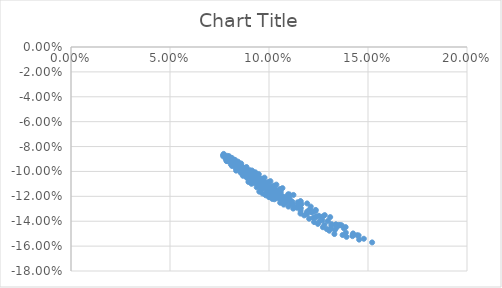
| Category | Series 0 |
|---|---|
| 0.07849210297705407 | -0.092 |
| 0.0811743257709537 | -0.094 |
| 0.08559861464190656 | -0.1 |
| 0.08865699809654287 | -0.103 |
| 0.0918520796829344 | -0.106 |
| 0.09573665319920564 | -0.11 |
| 0.09916619754605611 | -0.113 |
| 0.10387649270633424 | -0.117 |
| 0.10808851076847913 | -0.121 |
| 0.1118035528330265 | -0.124 |
| 0.11558868214379826 | -0.127 |
| 0.12127132130758715 | -0.133 |
| 0.1251883458378177 | -0.136 |
| 0.12973217934383538 | -0.14 |
| 0.13374420981332527 | -0.143 |
| 0.13779836612817092 | -0.146 |
| 0.14246406537783846 | -0.15 |
| 0.14791270222244338 | -0.154 |
| 0.15207736131235677 | -0.157 |
| 0.0833814307801798 | -0.099 |
| 0.08683115969566685 | -0.103 |
| 0.08880676271872487 | -0.105 |
| 0.09252270961221412 | -0.109 |
| 0.09467047227318069 | -0.111 |
| 0.09802187939158186 | -0.114 |
| 0.10206178969027282 | -0.118 |
| 0.10442470539097172 | -0.12 |
| 0.10804075292779088 | -0.122 |
| 0.11231933829241132 | -0.127 |
| 0.11608447652906288 | -0.13 |
| 0.11924286329137909 | -0.132 |
| 0.1237006269620872 | -0.136 |
| 0.12693277459077076 | -0.139 |
| 0.13148073296946738 | -0.143 |
| 0.13418809053347397 | -0.145 |
| 0.13881037753769906 | -0.149 |
| 0.1421556177082096 | -0.152 |
| 0.14552048095315892 | -0.155 |
| 0.08961711038147725 | -0.108 |
| 0.09114011177796506 | -0.11 |
| 0.09378573611604699 | -0.113 |
| 0.09590673387094169 | -0.114 |
| 0.09868984598151245 | -0.117 |
| 0.10093678670850117 | -0.119 |
| 0.10383717438005824 | -0.122 |
| 0.10619284299159418 | -0.123 |
| 0.10859855041904543 | -0.125 |
| 0.11286548480720748 | -0.129 |
| 0.11596493645428099 | -0.132 |
| 0.1191016679560657 | -0.134 |
| 0.12227281026450827 | -0.137 |
| 0.12547575441907483 | -0.14 |
| 0.1280261589043001 | -0.143 |
| 0.13127682578834932 | -0.146 |
| 0.13325904506316058 | -0.147 |
| 0.13715070052754968 | -0.151 |
| 0.1391586222896598 | -0.153 |
| 0.09510931711654969 | -0.116 |
| 0.09670132659841102 | -0.118 |
| 0.09832324809696294 | -0.119 |
| 0.09997362579055317 | -0.121 |
| 0.10165107366875394 | -0.122 |
| 0.10274384304672825 | -0.122 |
| 0.10564920168064439 | -0.125 |
| 0.10741169900584152 | -0.127 |
| 0.10979202662454098 | -0.128 |
| 0.11221973653686829 | -0.13 |
| 0.1159002454778847 | -0.134 |
| 0.11776940820301726 | -0.135 |
| 0.12026264207487335 | -0.138 |
| 0.12277283353342405 | -0.141 |
| 0.12468709261671139 | -0.142 |
| 0.12722627658530808 | -0.145 |
| 0.12916722053590737 | -0.146 |
| 0.13044814280565367 | -0.148 |
| 0.13301976983096028 | -0.15 |
| 0.07822905865678728 | -0.089 |
| 0.08097957270178449 | -0.092 |
| 0.08236788085575084 | -0.093 |
| 0.084889873784626 | -0.096 |
| 0.08591629263298864 | -0.096 |
| 0.08750258803188682 | -0.097 |
| 0.08912208857341217 | -0.099 |
| 0.09024580869491589 | -0.099 |
| 0.09192501018924845 | -0.1 |
| 0.09363257550935863 | -0.102 |
| 0.09704292489098112 | -0.106 |
| 0.0999808555089506 | -0.109 |
| 0.10297138273422739 | -0.112 |
| 0.1060100554338495 | -0.114 |
| 0.1103126754157474 | -0.119 |
| 0.11592994606834588 | -0.124 |
| 0.12108860662438246 | -0.128 |
| 0.12816872656147238 | -0.135 |
| 0.13870159746175426 | -0.145 |
| 0.08160285703052578 | -0.095 |
| 0.08348862843864494 | -0.096 |
| 0.08546133636133703 | -0.098 |
| 0.08805931034306258 | -0.101 |
| 0.08965325537013248 | -0.102 |
| 0.09127935388551334 | -0.104 |
| 0.09293591813706709 | -0.105 |
| 0.0946213480200461 | -0.107 |
| 0.09747758711142347 | -0.109 |
| 0.09922898461902414 | -0.111 |
| 0.10336109981956515 | -0.115 |
| 0.10581765924118058 | -0.117 |
| 0.11009598525346843 | -0.121 |
| 0.11444827102217514 | -0.125 |
| 0.12081331408204345 | -0.13 |
| 0.12730151203727216 | -0.136 |
| 0.13519327501638426 | -0.143 |
| 0.1452691534604774 | -0.151 |
| 0.0788787536411368 | -0.092 |
| 0.08312837440972774 | -0.097 |
| 0.085045745859657 | -0.099 |
| 0.08760035880392981 | -0.102 |
| 0.09023834458433486 | -0.104 |
| 0.0918520796829344 | -0.106 |
| 0.09349652634064731 | -0.107 |
| 0.09573665319920564 | -0.11 |
| 0.09743841982144451 | -0.111 |
| 0.09916619754605611 | -0.113 |
| 0.10091865041267142 | -0.114 |
| 0.10387649270633424 | -0.117 |
| 0.10688390650521354 | -0.12 |
| 0.11058067157896682 | -0.123 |
| 0.11492392590011687 | -0.127 |
| 0.12001186464518468 | -0.131 |
| 0.12646402436956816 | -0.137 |
| 0.13374420981332527 | -0.143 |
| 0.14452271871474948 | -0.151 |
| 0.08130091331750335 | -0.096 |
| 0.08569504999576223 | -0.101 |
| 0.08823589304508511 | -0.104 |
| 0.09143581655516232 | -0.108 |
| 0.09414068191080142 | -0.111 |
| 0.09637320318831566 | -0.113 |
| 0.0969150113715317 | -0.114 |
| 0.09919242179984171 | -0.116 |
| 0.10090858400734913 | -0.118 |
| 0.10207140044719216 | -0.119 |
| 0.10382400090768831 | -0.12 |
| 0.10559936423405429 | -0.122 |
| 0.10859855041904543 | -0.125 |
| 0.11105104472573117 | -0.126 |
| 0.11413629455739308 | -0.129 |
| 0.11916560504409618 | -0.133 |
| 0.1237006269620872 | -0.136 |
| 0.13160072027135306 | -0.142 |
| 0.07680502588611007 | -0.087 |
| 0.07712202008027774 | -0.086 |
| 0.07893050702036414 | -0.087 |
| 0.07985721487562175 | -0.088 |
| 0.08132213667552692 | -0.089 |
| 0.08282726149151125 | -0.091 |
| 0.08437043774819197 | -0.092 |
| 0.08594961589436044 | -0.094 |
| 0.08863840954822756 | -0.096 |
| 0.09140180971448308 | -0.099 |
| 0.09310800124228577 | -0.101 |
| 0.09484123132115391 | -0.102 |
| 0.09775156014153447 | -0.105 |
| 0.10071726693416282 | -0.108 |
| 0.1037336020981766 | -0.111 |
| 0.1067962759033771 | -0.113 |
| 0.11235447893947857 | -0.119 |
| 0.11927553767714538 | -0.126 |
| 0.07692371617648976 | -0.088 |
| 0.07906357258786349 | -0.09 |
| 0.07994208478115028 | -0.09 |
| 0.08236788085575084 | -0.093 |
| 0.08334377057565001 | -0.093 |
| 0.08487538556536457 | -0.094 |
| 0.08644320819416787 | -0.096 |
| 0.0880453042351461 | -0.097 |
| 0.09020901699208869 | -0.1 |
| 0.09298775498995428 | -0.103 |
| 0.09469772711230665 | -0.104 |
| 0.09643415706755694 | -0.106 |
| 0.09935586374477952 | -0.109 |
| 0.10233142561600621 | -0.111 |
| 0.10535627970714036 | -0.114 |
| 0.10964283646901699 | -0.118 |
| 0.11592994606834588 | -0.124 |
| 0.1236217647769235 | -0.131 |
| 0.13665780284159268 | -0.143 |
| 0.07835052949181369 | -0.09 |
| 0.08053764183772225 | -0.092 |
| 0.08295137059884787 | -0.095 |
| 0.08390111750932219 | -0.095 |
| 0.08542058277651929 | -0.097 |
| 0.08697645998415611 | -0.098 |
| 0.08910732021690403 | -0.101 |
| 0.0907319466426301 | -0.102 |
| 0.09238727160065137 | -0.104 |
| 0.09407167455186603 | -0.105 |
| 0.09578362145534135 | -0.107 |
| 0.09752166175848469 | -0.108 |
| 0.10100422255979274 | -0.112 |
| 0.10280206587526339 | -0.114 |
| 0.10581765924118058 | -0.117 |
| 0.1095351281436742 | -0.119 |
| 0.11636623772916771 | -0.126 |
| 0.12347615059587995 | -0.132 |
| 0.13592363721581804 | -0.143 |
| 0.08075656278214269 | -0.094 |
| 0.08357497561920513 | -0.097 |
| 0.0860719114004363 | -0.1 |
| 0.08760035880392981 | -0.102 |
| 0.08916401729373899 | -0.103 |
| 0.09132275011106632 | -0.106 |
| 0.0918520796829344 | -0.106 |
| 0.09349652634064731 | -0.107 |
| 0.09573665319920564 | -0.11 |
| 0.09743841982144451 | -0.111 |
| 0.09916619754605611 | -0.113 |
| 0.09975498545523767 | -0.113 |
| 0.10208937202382763 | -0.116 |
| 0.10506491813011391 | -0.119 |
| 0.10688390650521354 | -0.12 |
| 0.11058067157896682 | -0.123 |
| 0.11492392590011687 | -0.127 |
| 0.12195724840558145 | -0.133 |
| 0.13374420981332527 | -0.143 |
| 0.0788787536411368 | -0.092 |
| 0.14230432998540704 | -0.151 |
| 0.13090858492261587 | -0.137 |